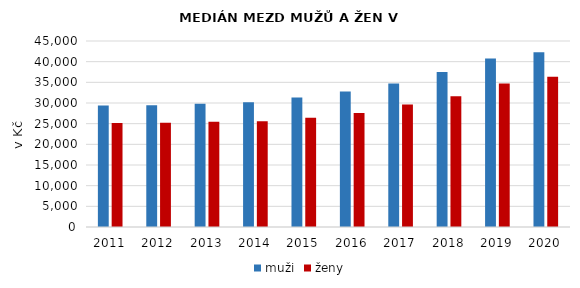
| Category | muži | ženy |
|---|---|---|
| 2011.0 | 29393 | 25187 |
| 2012.0 | 29476 | 25223 |
| 2013.0 | 29816 | 25444 |
| 2014.0 | 30207 | 25577 |
| 2015.0 | 31321 | 26409 |
| 2016.0 | 32772 | 27579 |
| 2017.0 | 34722 | 29648 |
| 2018.0 | 37497 | 31616 |
| 2019.0 | 40769 | 34692 |
| 2020.0 | 42300 | 36351 |